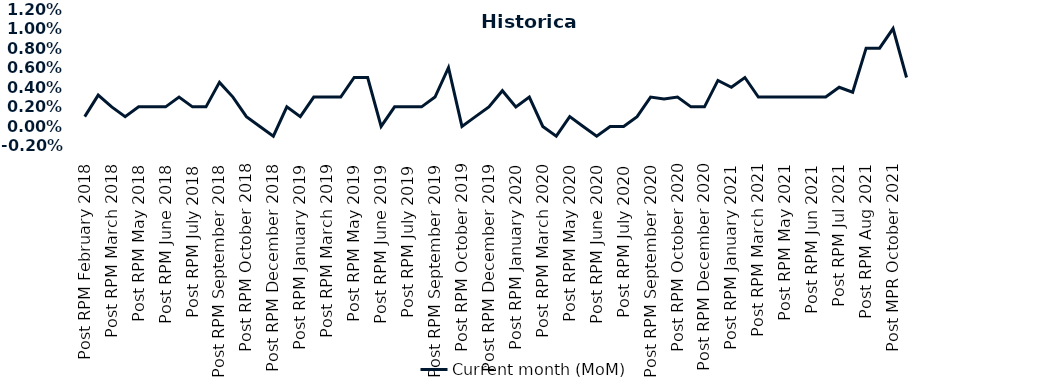
| Category | Current month (MoM)  |
|---|---|
| Post RPM February 2018 | 0.001 |
| Pre RPM March 2018 | 0.003 |
| Post RPM March 2018 | 0.002 |
| Pre RPM May 2018 | 0.001 |
| Post RPM May 2018 | 0.002 |
| Pre RPM June 2018 | 0.002 |
| Post RPM June 2018 | 0.002 |
| Pre RPM July 2018 | 0.003 |
| Post RPM July 2018 | 0.002 |
| Pre RPM September 2018 | 0.002 |
| Post RPM September 2018 | 0.004 |
| Pre RPM October 2018 | 0.003 |
| Post RPM October 2018 | 0.001 |
| Pre RPM December 2018 | 0 |
| Post RPM December 2018 | -0.001 |
| Pre RPM January 2019 | 0.002 |
| Post RPM January 2019 | 0.001 |
| Pre RPM March 2019 | 0.003 |
| Post RPM March 2019 | 0.003 |
| Pre RPM May 2019 | 0.003 |
| Post RPM May 2019 | 0.005 |
| Pre RPM June 2019 | 0.005 |
| Post RPM June 2019 | 0 |
| Pre RPM July 2019 | 0.002 |
| Post RPM July 2019 | 0.002 |
| Pre RPM September 2019 | 0.002 |
| Post RPM September 2019 | 0.003 |
| Pre RPM October 2019 | 0.006 |
| Post RPM October 2019 | 0 |
| Pre RPM December 2019 | 0.001 |
| Post RPM December 2019 | 0.002 |
| Pre RPM January 2020 | 0.004 |
| Post RPM January 2020 | 0.002 |
| Pre RPM March 2020 | 0.003 |
| Post RPM March 2020 | 0 |
| Pre RPM May 2020 | -0.001 |
| Post RPM May 2020 | 0.001 |
| Pre RPM June 2020 | 0 |
| Post RPM June 2020 | -0.001 |
| Pre RPM July 2020 | 0 |
| Post RPM July 2020 | 0 |
| Pre RPM September 2020 | 0.001 |
| Post RPM September 2020 | 0.003 |
| Pre RPM October 2020 | 0.003 |
| Post RPM October 2020 | 0.003 |
| Pre RPM December 2020 | 0.002 |
|  Post RPM December 2020 | 0.002 |
| Pre RPM January 2021 | 0.005 |
| Post RPM January 2021 | 0.004 |
|  Pre RPM March 2021 | 0.005 |
|  Post RPM March 2021 | 0.003 |
|  Pre RPM May 2021 | 0.003 |
|  Post RPM May 2021 | 0.003 |
|  Pre RPM Jun 2021 | 0.003 |
|   Post RPM Jun 2021 | 0.003 |
| Pre RPM Jul 2021 | 0.003 |
|  Post RPM Jul 2021 | 0.004 |
| Pre RPM Aug 2021 | 0.004 |
|  Post RPM Aug 2021 | 0.008 |
| Pre MPR October 2021 | 0.008 |
| Post MPR October 2021 | 0.01 |
| Pre MPR December 2021 | 0.005 |